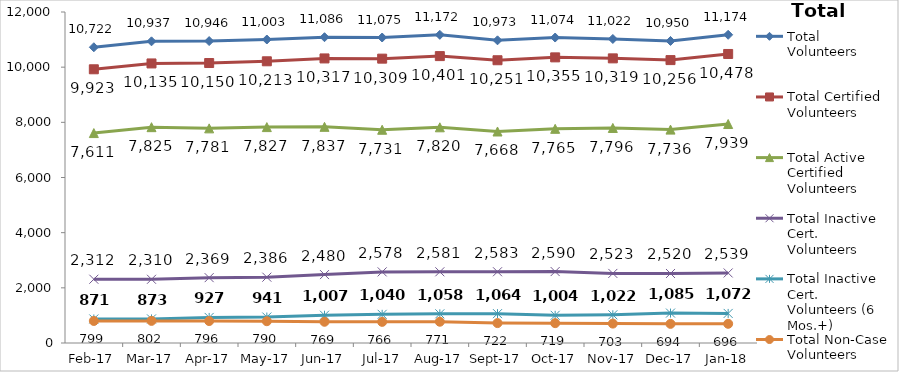
| Category | Total Volunteers | Total Certified Volunteers | Total Active Certified Volunteers | Total Inactive Cert. Volunteers | Total Inactive Cert. Volunteers (6 Mos.+) | Total Non-Case Volunteers |
|---|---|---|---|---|---|---|
| 2017-02-01 | 10722 | 9923 | 7611 | 2312 | 871 | 799 |
| 2017-03-01 | 10937 | 10135 | 7825 | 2310 | 873 | 802 |
| 2017-04-01 | 10946 | 10150 | 7781 | 2369 | 927 | 796 |
| 2017-05-01 | 11003 | 10213 | 7827 | 2386 | 941 | 790 |
| 2017-06-01 | 11086 | 10317 | 7837 | 2480 | 1007 | 769 |
| 2017-07-01 | 11075 | 10309 | 7731 | 2578 | 1040 | 766 |
| 2017-08-01 | 11172 | 10401 | 7820 | 2581 | 1058 | 771 |
| 2017-09-01 | 10973 | 10251 | 7668 | 2583 | 1064 | 722 |
| 2017-10-01 | 11074 | 10355 | 7765 | 2590 | 1004 | 719 |
| 2017-11-01 | 11022 | 10319 | 7796 | 2523 | 1022 | 703 |
| 2017-12-01 | 10950 | 10256 | 7736 | 2520 | 1085 | 694 |
| 2018-01-01 | 11174 | 10478 | 7939 | 2539 | 1072 | 696 |